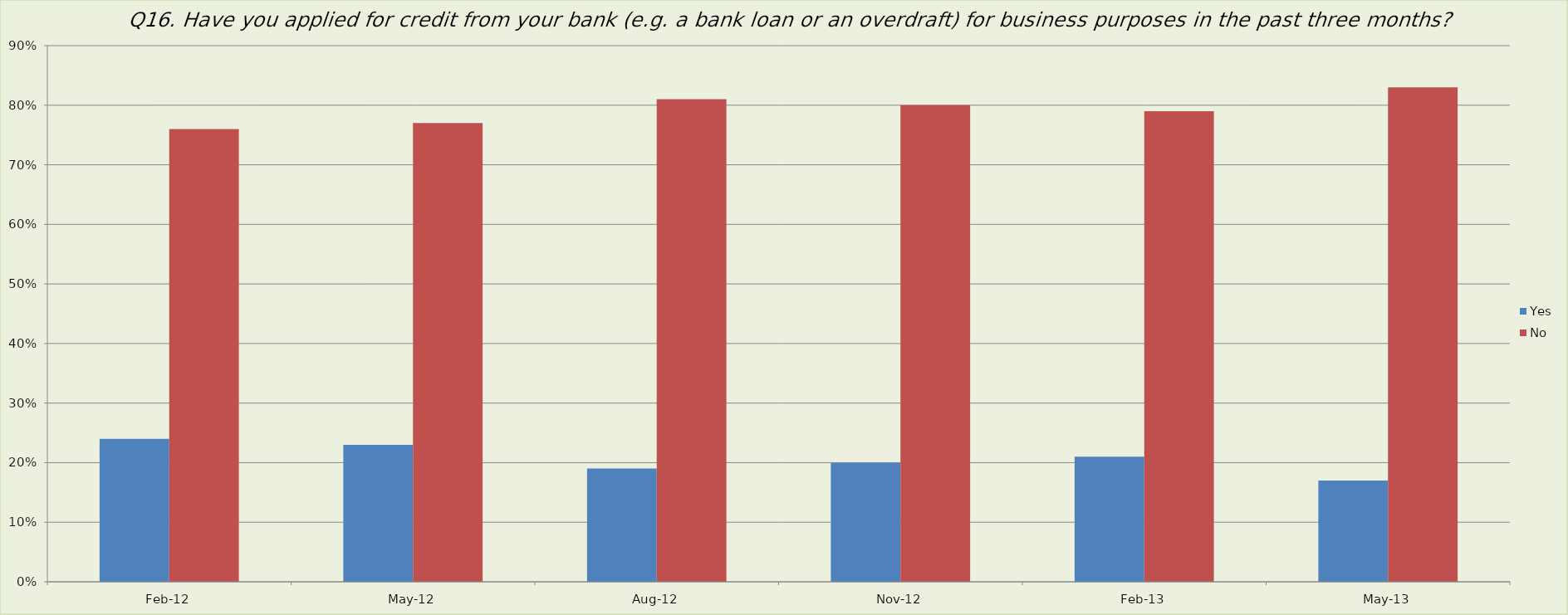
| Category | Yes | No |
|---|---|---|
| 2012-02-01 | 0.24 | 0.76 |
| 2012-05-01 | 0.23 | 0.77 |
| 2012-08-01 | 0.19 | 0.81 |
| 2012-11-01 | 0.2 | 0.8 |
| 2013-02-01 | 0.21 | 0.79 |
| 2013-05-01 | 0.17 | 0.83 |